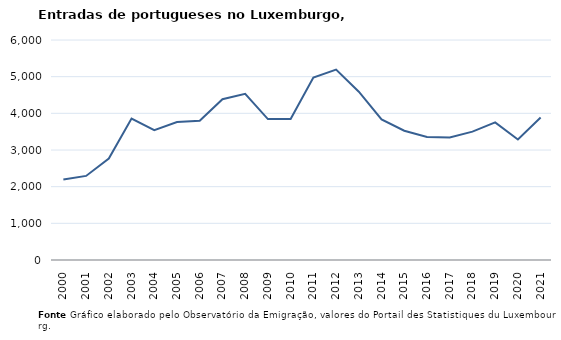
| Category | Entradas |
|---|---|
| 2000.0 | 2193 |
| 2001.0 | 2293 |
| 2002.0 | 2767 |
| 2003.0 | 3857 |
| 2004.0 | 3542 |
| 2005.0 | 3761 |
| 2006.0 | 3796 |
| 2007.0 | 4385 |
| 2008.0 | 4531 |
| 2009.0 | 3844 |
| 2010.0 | 3845 |
| 2011.0 | 4977 |
| 2012.0 | 5193 |
| 2013.0 | 4590 |
| 2014.0 | 3832 |
| 2015.0 | 3525 |
| 2016.0 | 3355 |
| 2017.0 | 3342 |
| 2018.0 | 3501 |
| 2019.0 | 3752 |
| 2020.0 | 3286 |
| 2021.0 | 3885 |